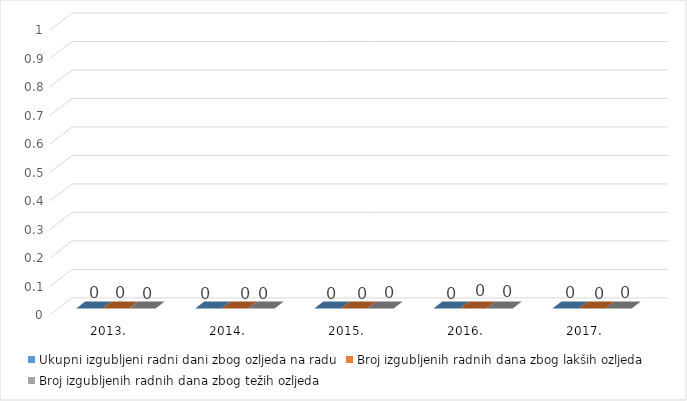
| Category | Ukupni izgubljeni radni dani zbog ozljeda na radu | Broj izgubljenih radnih dana zbog lakših ozljeda | Broj izgubljenih radnih dana zbog težih ozljeda |
|---|---|---|---|
| 2013. | 0 | 0 | 0 |
| 2014. | 0 | 0 | 0 |
| 2015. | 0 | 0 | 0 |
| 2016. | 0 | 0 | 0 |
| 2017. | 0 | 0 | 0 |